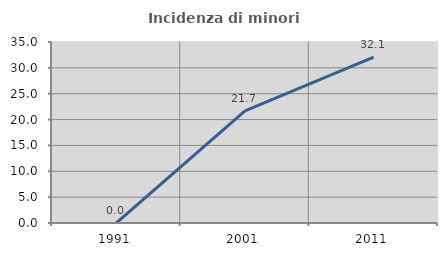
| Category | Incidenza di minori stranieri |
|---|---|
| 1991.0 | 0 |
| 2001.0 | 21.667 |
| 2011.0 | 32.061 |